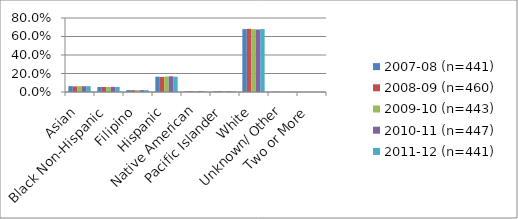
| Category | 2007-08 (n=441) | 2008-09 (n=460) | 2009-10 (n=443) | 2010-11 (n=447) | 2011-12 (n=441) |
|---|---|---|---|---|---|
| Asian | 0.063 | 0.061 | 0.063 | 0.063 | 0.063 |
| Black Non-Hispanic | 0.054 | 0.054 | 0.054 | 0.056 | 0.054 |
| Filipino | 0.02 | 0.02 | 0.02 | 0.02 | 0.02 |
| Hispanic | 0.166 | 0.163 | 0.167 | 0.17 | 0.166 |
| Native American | 0.007 | 0.009 | 0.009 | 0.009 | 0.007 |
| Pacific Islander | 0.007 | 0.009 | 0.007 | 0.007 | 0.007 |
| White | 0.68 | 0.683 | 0.679 | 0.676 | 0.68 |
| Unknown/ Other | 0.002 | 0.002 | 0 | 0 | 0.002 |
| Two or More | 0 | 0 | 0 | 0 | 0 |